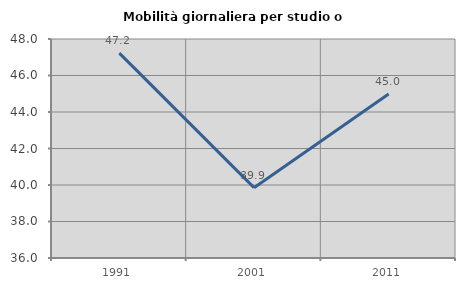
| Category | Mobilità giornaliera per studio o lavoro |
|---|---|
| 1991.0 | 47.226 |
| 2001.0 | 39.853 |
| 2011.0 | 44.985 |